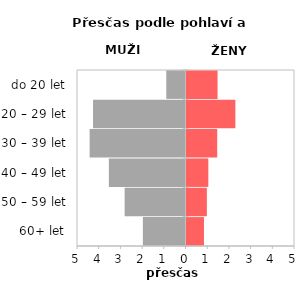
| Category | Přesčas |
|---|---|
| 60+ let | 0.804 |
| 50 – 59 let | 0.938 |
| 40 – 49 let | 1.006 |
| 30 – 39 let | 1.415 |
| 20 – 29 let | 2.252 |
| do 20 let | 1.431 |